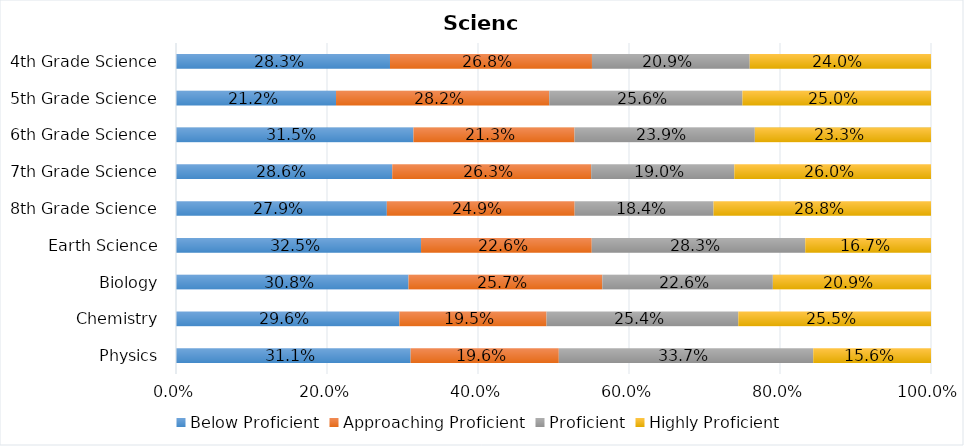
| Category | Below Proficient | Approaching Proficient | Proficient | Highly Proficient |
|---|---|---|---|---|
| Physics | 0.311 | 0.196 | 0.337 | 0.156 |
| Chemistry | 0.296 | 0.195 | 0.254 | 0.255 |
| Biology | 0.308 | 0.257 | 0.226 | 0.209 |
| Earth Science | 0.325 | 0.226 | 0.283 | 0.167 |
| 8th Grade Science | 0.279 | 0.249 | 0.184 | 0.288 |
| 7th Grade Science | 0.286 | 0.263 | 0.19 | 0.26 |
| 6th Grade Science | 0.315 | 0.213 | 0.239 | 0.233 |
| 5th Grade Science | 0.212 | 0.282 | 0.256 | 0.25 |
| 4th Grade Science | 0.283 | 0.268 | 0.209 | 0.24 |